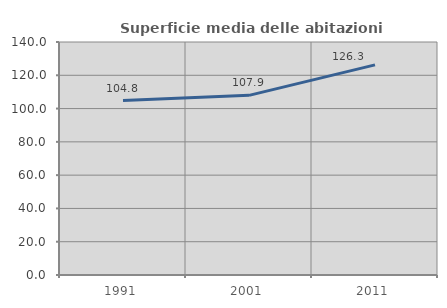
| Category | Superficie media delle abitazioni occupate |
|---|---|
| 1991.0 | 104.82 |
| 2001.0 | 107.943 |
| 2011.0 | 126.251 |